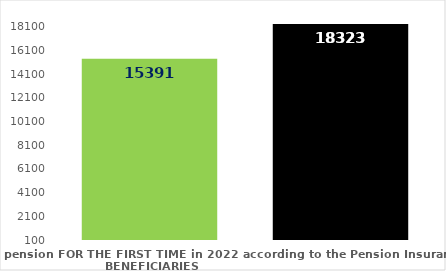
| Category | broj korisnika |
|---|---|
| Pension beneficiaries entitled to pension FOR THE FIRST TIME in 2022 according to the Pension Insurance Act  - NEW BENEFICIARIES | 15391 |
| Pension beneficiaries whose pension entitlement ceased in 2022  -  death caused,   
and who were retired according to the Pension Insurance Act   | 18323 |